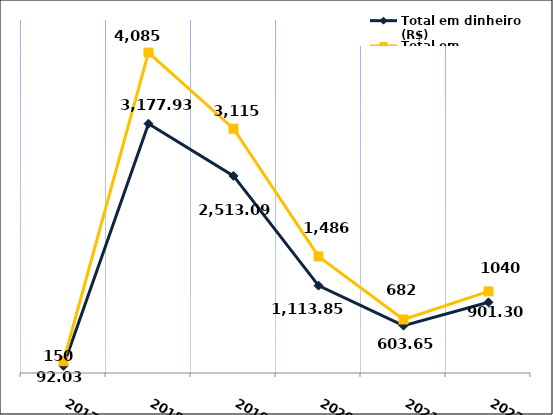
| Category | Total em dinheiro (R$) |
|---|---|
| 2017.0 | 92.03 |
| 2018.0 | 3177.93 |
| 2019.0 | 2513.09 |
| 2020.0 | 1113.85 |
| 2021.0 | 603.65 |
| 2022.0 | 901.3 |